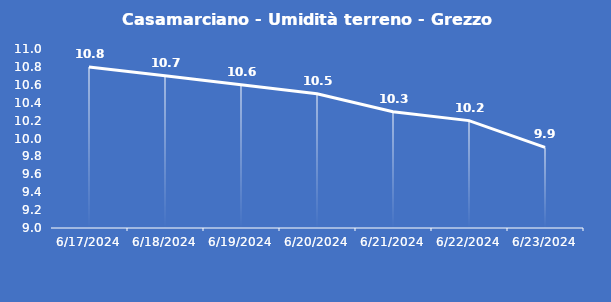
| Category | Casamarciano - Umidità terreno - Grezzo (%VWC) |
|---|---|
| 6/17/24 | 10.8 |
| 6/18/24 | 10.7 |
| 6/19/24 | 10.6 |
| 6/20/24 | 10.5 |
| 6/21/24 | 10.3 |
| 6/22/24 | 10.2 |
| 6/23/24 | 9.9 |